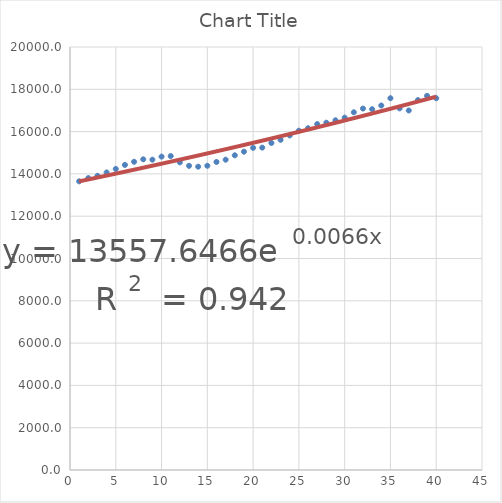
| Category | Series 0 |
|---|---|
| 1.0 | 13649.8 |
| 2.0 | 13802.9 |
| 3.0 | 13910.5 |
| 4.0 | 14068.4 |
| 5.0 | 14235 |
| 6.0 | 14424.5 |
| 7.0 | 14571.9 |
| 8.0 | 14690 |
| 9.0 | 14672.9 |
| 10.0 | 14817.1 |
| 11.0 | 14844.3 |
| 12.0 | 14546.7 |
| 13.0 | 14381.2 |
| 14.0 | 14342.1 |
| 15.0 | 14384.4 |
| 16.0 | 14564.1 |
| 17.0 | 14672.5 |
| 18.0 | 14879.2 |
| 19.0 | 15049.8 |
| 20.0 | 15231.7 |
| 21.0 | 15242.9 |
| 22.0 | 15461.9 |
| 23.0 | 15611.8 |
| 24.0 | 15818.7 |
| 25.0 | 16041.6 |
| 26.0 | 16160.4 |
| 27.0 | 16356 |
| 28.0 | 16420.3 |
| 29.0 | 16535.3 |
| 30.0 | 16661 |
| 31.0 | 16912.9 |
| 32.0 | 17089.6 |
| 33.0 | 17059 |
| 34.0 | 17234 |
| 35.0 | 17578 |
| 36.0 | 17098 |
| 37.0 | 16998 |
| 38.0 | 17490 |
| 39.0 | 17690 |
| 40.0 | 17578 |